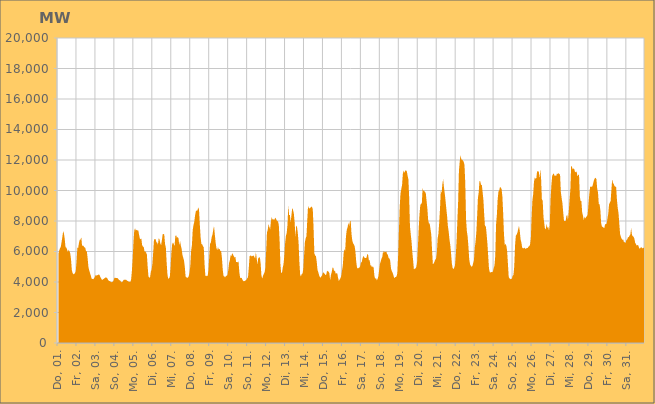
| Category | Series 0 |
|---|---|
|  Do, 01.  | 5838.284 |
|  Do, 01.  | 6069.96 |
|  Do, 01.  | 6217.359 |
|  Do, 01.  | 6301.179 |
|  Do, 01.  | 6617.244 |
|  Do, 01.  | 6944.07 |
|  Do, 01.  | 7326.168 |
|  Do, 01.  | 7187.628 |
|  Do, 01.  | 6828.915 |
|  Do, 01.  | 6288.433 |
|  Do, 01.  | 6265.122 |
|  Do, 01.  | 6128.998 |
|  Do, 01.  | 5971.522 |
|  Do, 01.  | 6115.487 |
|  Do, 01.  | 6014.973 |
|  Do, 01.  | 5880.207 |
|  Do, 01.  | 5474.756 |
|  Fr, 02.  | 4782.747 |
|  Fr, 02.  | 4586.691 |
|  Fr, 02.  | 4509.148 |
|  Fr, 02.  | 4532.63 |
|  Fr, 02.  | 4591.195 |
|  Fr, 02.  | 4716.959 |
|  Fr, 02.  | 5371.067 |
|  Fr, 02.  | 6249.423 |
|  Fr, 02.  | 6234.404 |
|  Fr, 02.  | 6548.627 |
|  Fr, 02.  | 6761.243 |
|  Fr, 02.  | 6771.288 |
|  Fr, 02.  | 6942.361 |
|  Fr, 02.  | 6353.266 |
|  Fr, 02.  | 6406.537 |
|  Fr, 02.  | 6345.504 |
|  Fr, 02.  | 6270.309 |
|  Fr, 02.  | 6242.791 |
|  Fr, 02.  | 6012.417 |
|  Fr, 02.  | 6024.662 |
|  Fr, 02.  | 5564.024 |
|  Fr, 02.  | 4993.995 |
|  Fr, 02.  | 4764.419 |
|  Fr, 02.  | 4591.239 |
|  Sa, 03.  | 4433.387 |
|  Sa, 03.  | 4223.399 |
|  Sa, 03.  | 4198.5 |
|  Sa, 03.  | 4187.236 |
|  Sa, 03.  | 4242.21 |
|  Sa, 03.  | 4322.197 |
|  Sa, 03.  | 4448.25 |
|  Sa, 03.  | 4423.887 |
|  Sa, 03.  | 4439.22 |
|  Sa, 03.  | 4464.962 |
|  Sa, 03.  | 4487.638 |
|  Sa, 03.  | 4472.578 |
|  Sa, 03.  | 4346.734 |
|  Sa, 03.  | 4243.644 |
|  Sa, 03.  | 4150.589 |
|  Sa, 03.  | 4146.145 |
|  Sa, 03.  | 4193.448 |
|  Sa, 03.  | 4234.954 |
|  Sa, 03.  | 4258.034 |
|  Sa, 03.  | 4318.115 |
|  Sa, 03.  | 4276.697 |
|  Sa, 03.  | 4238 |
|  Sa, 03.  | 4132.854 |
|  Sa, 03.  | 4068.32 |
|  So, 04.  | 4059.379 |
|  So, 04.  | 4028.524 |
|  So, 04.  | 3978.109 |
|  So, 04.  | 4019.551 |
|  So, 04.  | 4017.079 |
|  So, 04.  | 4122.61 |
|  So, 04.  | 4276.015 |
|  So, 04.  | 4271.532 |
|  So, 04.  | 4265.931 |
|  So, 04.  | 4260.071 |
|  So, 04.  | 4252.157 |
|  So, 04.  | 4185.498 |
|  So, 04.  | 4120.266 |
|  So, 04.  | 4107.73 |
|  So, 04.  | 4039.33 |
|  So, 04.  | 3981.873 |
|  So, 04.  | 4008.145 |
|  So, 04.  | 4092.39 |
|  So, 04.  | 4150.791 |
|  So, 04.  | 4146.816 |
|  So, 04.  | 4154.551 |
|  So, 04.  | 4141.318 |
|  So, 04.  | 4089.946 |
|  So, 04.  | 4059.761 |
|  Mo, 05.  | 4026.191 |
|  Mo, 05.  | 4009.999 |
|  Mo, 05.  | 4005.91 |
|  Mo, 05.  | 4140.828 |
|  Mo, 05.  | 4688.67 |
|  Mo, 05.  | 5519.541 |
|  Mo, 05.  | 6585.331 |
|  Mo, 05.  | 7371.048 |
|  Mo, 05.  | 7526.508 |
|  Mo, 05.  | 7375.135 |
|  Mo, 05.  | 7422.02 |
|  Mo, 05.  | 7369.848 |
|  Mo, 05.  | 7403.505 |
|  Mo, 05.  | 7136.978 |
|  Mo, 05.  | 6861.888 |
|  Mo, 05.  | 6804.982 |
|  Mo, 05.  | 6856.791 |
|  Mo, 05.  | 6416.836 |
|  Mo, 05.  | 6321.34 |
|  Mo, 05.  | 6299.424 |
|  Mo, 05.  | 5989.073 |
|  Mo, 05.  | 6007.384 |
|  Mo, 05.  | 5941 |
|  Mo, 05.  | 5798.07 |
|  Di, 06.  | 4998.563 |
|  Di, 06.  | 4357.519 |
|  Di, 06.  | 4290.608 |
|  Di, 06.  | 4301.307 |
|  Di, 06.  | 4677.619 |
|  Di, 06.  | 4809.868 |
|  Di, 06.  | 5202.935 |
|  Di, 06.  | 5948.311 |
|  Di, 06.  | 6785.128 |
|  Di, 06.  | 6806.878 |
|  Di, 06.  | 6813.454 |
|  Di, 06.  | 6613.606 |
|  Di, 06.  | 6583.537 |
|  Di, 06.  | 6450.945 |
|  Di, 06.  | 6875.623 |
|  Di, 06.  | 6797.751 |
|  Di, 06.  | 6525.943 |
|  Di, 06.  | 6421.039 |
|  Di, 06.  | 6737.769 |
|  Di, 06.  | 7133.547 |
|  Di, 06.  | 7152.989 |
|  Di, 06.  | 7102.554 |
|  Di, 06.  | 6485.341 |
|  Di, 06.  | 6273.902 |
|  Mi, 07.  | 5291.477 |
|  Mi, 07.  | 4508.332 |
|  Mi, 07.  | 4201.357 |
|  Mi, 07.  | 4248.913 |
|  Mi, 07.  | 4320.959 |
|  Mi, 07.  | 4943.692 |
|  Mi, 07.  | 5891.996 |
|  Mi, 07.  | 6473.568 |
|  Mi, 07.  | 6589.952 |
|  Mi, 07.  | 6508.857 |
|  Mi, 07.  | 6335.647 |
|  Mi, 07.  | 7016.5 |
|  Mi, 07.  | 7073.372 |
|  Mi, 07.  | 6903.334 |
|  Mi, 07.  | 6945.536 |
|  Mi, 07.  | 6871.138 |
|  Mi, 07.  | 6403.369 |
|  Mi, 07.  | 6700.854 |
|  Mi, 07.  | 6378.053 |
|  Mi, 07.  | 6172.952 |
|  Mi, 07.  | 5782.392 |
|  Mi, 07.  | 5598.976 |
|  Mi, 07.  | 5415.007 |
|  Mi, 07.  | 4988.347 |
|  Do, 08.  | 4360.781 |
|  Do, 08.  | 4307.284 |
|  Do, 08.  | 4274.73 |
|  Do, 08.  | 4289.737 |
|  Do, 08.  | 4379.287 |
|  Do, 08.  | 4630.871 |
|  Do, 08.  | 5068.321 |
|  Do, 08.  | 6037.794 |
|  Do, 08.  | 6410.6 |
|  Do, 08.  | 7394.951 |
|  Do, 08.  | 7733.768 |
|  Do, 08.  | 7941.419 |
|  Do, 08.  | 8363.702 |
|  Do, 08.  | 8640.065 |
|  Do, 08.  | 8682.167 |
|  Do, 08.  | 8683.936 |
|  Do, 08.  | 8896.939 |
|  Do, 08.  | 8736.82 |
|  Do, 08.  | 7786.584 |
|  Do, 08.  | 6935.824 |
|  Do, 08.  | 6492.675 |
|  Do, 08.  | 6475.544 |
|  Do, 08.  | 6347.565 |
|  Do, 08.  | 6284.995 |
|  Fr, 09.  | 5175.805 |
|  Fr, 09.  | 4411.382 |
|  Fr, 09.  | 4411.262 |
|  Fr, 09.  | 4383.125 |
|  Fr, 09.  | 4417.873 |
|  Fr, 09.  | 4801.102 |
|  Fr, 09.  | 5715.314 |
|  Fr, 09.  | 6509.222 |
|  Fr, 09.  | 6591.06 |
|  Fr, 09.  | 6939.726 |
|  Fr, 09.  | 7097.465 |
|  Fr, 09.  | 7413.318 |
|  Fr, 09.  | 7665.689 |
|  Fr, 09.  | 7109.803 |
|  Fr, 09.  | 6598.26 |
|  Fr, 09.  | 6233.001 |
|  Fr, 09.  | 6079.949 |
|  Fr, 09.  | 6292.68 |
|  Fr, 09.  | 6132.226 |
|  Fr, 09.  | 6181.967 |
|  Fr, 09.  | 6036.683 |
|  Fr, 09.  | 6030.111 |
|  Fr, 09.  | 5582.783 |
|  Fr, 09.  | 4830.854 |
|  Sa, 10.  | 4394.463 |
|  Sa, 10.  | 4374.086 |
|  Sa, 10.  | 4299.123 |
|  Sa, 10.  | 4392.528 |
|  Sa, 10.  | 4417.415 |
|  Sa, 10.  | 4448.242 |
|  Sa, 10.  | 4764.722 |
|  Sa, 10.  | 5233.12 |
|  Sa, 10.  | 5428.596 |
|  Sa, 10.  | 5756.808 |
|  Sa, 10.  | 5710.557 |
|  Sa, 10.  | 5887.337 |
|  Sa, 10.  | 5806.872 |
|  Sa, 10.  | 5690.213 |
|  Sa, 10.  | 5609.751 |
|  Sa, 10.  | 5641.794 |
|  Sa, 10.  | 5304.069 |
|  Sa, 10.  | 5304.222 |
|  Sa, 10.  | 5291.617 |
|  Sa, 10.  | 5353.647 |
|  Sa, 10.  | 4648.799 |
|  Sa, 10.  | 4295.502 |
|  Sa, 10.  | 4253.544 |
|  Sa, 10.  | 4272.617 |
|  So, 11.  | 4148.407 |
|  So, 11.  | 4062.998 |
|  So, 11.  | 4050.399 |
|  So, 11.  | 4071.035 |
|  So, 11.  | 4112.451 |
|  So, 11.  | 4144.704 |
|  So, 11.  | 4245.584 |
|  So, 11.  | 4309.784 |
|  So, 11.  | 4925.778 |
|  So, 11.  | 5690.34 |
|  So, 11.  | 5747.041 |
|  So, 11.  | 5674.559 |
|  So, 11.  | 5730.163 |
|  So, 11.  | 5689.383 |
|  So, 11.  | 5758.914 |
|  So, 11.  | 5640.602 |
|  So, 11.  | 5553.907 |
|  So, 11.  | 5953.618 |
|  So, 11.  | 5561.133 |
|  So, 11.  | 5132.685 |
|  So, 11.  | 5585.76 |
|  So, 11.  | 5579.77 |
|  So, 11.  | 5641.804 |
|  So, 11.  | 5201.269 |
|  Mo, 12.  | 4414.718 |
|  Mo, 12.  | 4231.42 |
|  Mo, 12.  | 4402.162 |
|  Mo, 12.  | 4535.949 |
|  Mo, 12.  | 4640.257 |
|  Mo, 12.  | 4935.785 |
|  Mo, 12.  | 6022.928 |
|  Mo, 12.  | 7248.038 |
|  Mo, 12.  | 7423.967 |
|  Mo, 12.  | 7805.238 |
|  Mo, 12.  | 7614.017 |
|  Mo, 12.  | 7463.201 |
|  Mo, 12.  | 7974.287 |
|  Mo, 12.  | 8260.465 |
|  Mo, 12.  | 8092.553 |
|  Mo, 12.  | 8130.125 |
|  Mo, 12.  | 8058.65 |
|  Mo, 12.  | 8160.743 |
|  Mo, 12.  | 8210.63 |
|  Mo, 12.  | 8064.475 |
|  Mo, 12.  | 8007.339 |
|  Mo, 12.  | 7974.572 |
|  Mo, 12.  | 7735.249 |
|  Mo, 12.  | 6700.836 |
|  Di, 13.  | 5146.422 |
|  Di, 13.  | 4593.487 |
|  Di, 13.  | 4603.94 |
|  Di, 13.  | 4939.973 |
|  Di, 13.  | 5192.146 |
|  Di, 13.  | 5738.624 |
|  Di, 13.  | 6554.945 |
|  Di, 13.  | 7023.418 |
|  Di, 13.  | 7220.844 |
|  Di, 13.  | 7765.521 |
|  Di, 13.  | 9040.237 |
|  Di, 13.  | 8395.793 |
|  Di, 13.  | 8391.384 |
|  Di, 13.  | 7911.724 |
|  Di, 13.  | 8388.636 |
|  Di, 13.  | 8865.622 |
|  Di, 13.  | 8720.192 |
|  Di, 13.  | 8493.211 |
|  Di, 13.  | 7940.669 |
|  Di, 13.  | 6963.544 |
|  Di, 13.  | 7700.133 |
|  Di, 13.  | 7632.044 |
|  Di, 13.  | 7230.369 |
|  Di, 13.  | 6589.781 |
|  Mi, 14.  | 5339.033 |
|  Mi, 14.  | 4482.851 |
|  Mi, 14.  | 4366.61 |
|  Mi, 14.  | 4520.774 |
|  Mi, 14.  | 4552.585 |
|  Mi, 14.  | 4835.391 |
|  Mi, 14.  | 5761.337 |
|  Mi, 14.  | 6608.807 |
|  Mi, 14.  | 6869.341 |
|  Mi, 14.  | 6999.013 |
|  Mi, 14.  | 8035.343 |
|  Mi, 14.  | 8982.962 |
|  Mi, 14.  | 8857.194 |
|  Mi, 14.  | 8821.02 |
|  Mi, 14.  | 8870.807 |
|  Mi, 14.  | 8942.107 |
|  Mi, 14.  | 8928.426 |
|  Mi, 14.  | 8766.124 |
|  Mi, 14.  | 7522.567 |
|  Mi, 14.  | 5876.222 |
|  Mi, 14.  | 5735.126 |
|  Mi, 14.  | 5701.514 |
|  Mi, 14.  | 5318.03 |
|  Mi, 14.  | 4790.274 |
|  Do, 15.  | 4641.297 |
|  Do, 15.  | 4442.467 |
|  Do, 15.  | 4320.562 |
|  Do, 15.  | 4289.356 |
|  Do, 15.  | 4385.777 |
|  Do, 15.  | 4463.116 |
|  Do, 15.  | 4635.253 |
|  Do, 15.  | 4594.274 |
|  Do, 15.  | 4538.257 |
|  Do, 15.  | 4466.3 |
|  Do, 15.  | 4467.368 |
|  Do, 15.  | 4740.441 |
|  Do, 15.  | 4704.173 |
|  Do, 15.  | 4681.504 |
|  Do, 15.  | 4575.955 |
|  Do, 15.  | 4117.87 |
|  Do, 15.  | 4474.166 |
|  Do, 15.  | 4649.174 |
|  Do, 15.  | 4949.576 |
|  Do, 15.  | 4926.898 |
|  Do, 15.  | 4705.59 |
|  Do, 15.  | 4761.182 |
|  Do, 15.  | 4541.561 |
|  Do, 15.  | 4574.133 |
|  Fr, 16.  | 4568.982 |
|  Fr, 16.  | 4276.202 |
|  Fr, 16.  | 4055.814 |
|  Fr, 16.  | 4162.918 |
|  Fr, 16.  | 4246.035 |
|  Fr, 16.  | 4399.295 |
|  Fr, 16.  | 4754.47 |
|  Fr, 16.  | 5087.843 |
|  Fr, 16.  | 5859.401 |
|  Fr, 16.  | 6148.99 |
|  Fr, 16.  | 6060.739 |
|  Fr, 16.  | 6984.952 |
|  Fr, 16.  | 7417.109 |
|  Fr, 16.  | 7578.792 |
|  Fr, 16.  | 7896.166 |
|  Fr, 16.  | 7668.844 |
|  Fr, 16.  | 7970.368 |
|  Fr, 16.  | 8018.609 |
|  Fr, 16.  | 7143.986 |
|  Fr, 16.  | 6720.794 |
|  Fr, 16.  | 6545.304 |
|  Fr, 16.  | 6464.661 |
|  Fr, 16.  | 6335.683 |
|  Fr, 16.  | 5976.97 |
|  Sa, 17.  | 5321.862 |
|  Sa, 17.  | 4949.645 |
|  Sa, 17.  | 4882.43 |
|  Sa, 17.  | 4920.575 |
|  Sa, 17.  | 4944.293 |
|  Sa, 17.  | 5034.639 |
|  Sa, 17.  | 5279.085 |
|  Sa, 17.  | 5317.498 |
|  Sa, 17.  | 5567.992 |
|  Sa, 17.  | 5710.331 |
|  Sa, 17.  | 5632.373 |
|  Sa, 17.  | 5571.872 |
|  Sa, 17.  | 5572.065 |
|  Sa, 17.  | 5593.363 |
|  Sa, 17.  | 5833.895 |
|  Sa, 17.  | 5787.231 |
|  Sa, 17.  | 5427.939 |
|  Sa, 17.  | 5423.641 |
|  Sa, 17.  | 5079.078 |
|  Sa, 17.  | 5080.742 |
|  Sa, 17.  | 4950.885 |
|  Sa, 17.  | 5031.101 |
|  Sa, 17.  | 4939.251 |
|  Sa, 17.  | 4406.891 |
|  So, 18.  | 4198.301 |
|  So, 18.  | 4282.472 |
|  So, 18.  | 4107.482 |
|  So, 18.  | 4195.86 |
|  So, 18.  | 4372.243 |
|  So, 18.  | 4780.243 |
|  So, 18.  | 5188.425 |
|  So, 18.  | 5350.864 |
|  So, 18.  | 5542.183 |
|  So, 18.  | 5638.607 |
|  So, 18.  | 6037.969 |
|  So, 18.  | 5905.502 |
|  So, 18.  | 6015 |
|  So, 18.  | 5956.332 |
|  So, 18.  | 6018.275 |
|  So, 18.  | 5827.577 |
|  So, 18.  | 5791.668 |
|  So, 18.  | 5573.189 |
|  So, 18.  | 5543.267 |
|  So, 18.  | 5385.71 |
|  So, 18.  | 4884.689 |
|  So, 18.  | 4723.663 |
|  So, 18.  | 4609.493 |
|  So, 18.  | 4462.552 |
|  Mo, 19.  | 4247.807 |
|  Mo, 19.  | 4311.431 |
|  Mo, 19.  | 4329.222 |
|  Mo, 19.  | 4361.841 |
|  Mo, 19.  | 4582.218 |
|  Mo, 19.  | 5691.175 |
|  Mo, 19.  | 7306.368 |
|  Mo, 19.  | 8878.472 |
|  Mo, 19.  | 9796.363 |
|  Mo, 19.  | 10093.189 |
|  Mo, 19.  | 10358.222 |
|  Mo, 19.  | 11092.372 |
|  Mo, 19.  | 11301.88 |
|  Mo, 19.  | 11152.729 |
|  Mo, 19.  | 11318.867 |
|  Mo, 19.  | 11318.199 |
|  Mo, 19.  | 11261.021 |
|  Mo, 19.  | 10977.977 |
|  Mo, 19.  | 10730.177 |
|  Mo, 19.  | 9558.51 |
|  Mo, 19.  | 7648.774 |
|  Mo, 19.  | 7128.25 |
|  Mo, 19.  | 6651.674 |
|  Mo, 19.  | 5950.547 |
|  Di, 20.  | 5409.848 |
|  Di, 20.  | 4822.269 |
|  Di, 20.  | 4881.608 |
|  Di, 20.  | 4888.259 |
|  Di, 20.  | 4976.979 |
|  Di, 20.  | 5282.412 |
|  Di, 20.  | 6245.57 |
|  Di, 20.  | 7428.679 |
|  Di, 20.  | 8370.268 |
|  Di, 20.  | 9004.075 |
|  Di, 20.  | 9146.274 |
|  Di, 20.  | 9135.82 |
|  Di, 20.  | 10145.512 |
|  Di, 20.  | 9983.426 |
|  Di, 20.  | 9990.168 |
|  Di, 20.  | 9888.28 |
|  Di, 20.  | 9840.652 |
|  Di, 20.  | 9336.417 |
|  Di, 20.  | 8837.784 |
|  Di, 20.  | 8095.137 |
|  Di, 20.  | 7835.428 |
|  Di, 20.  | 7831.601 |
|  Di, 20.  | 7471.004 |
|  Di, 20.  | 7098.428 |
|  Mi, 21.  | 6068.458 |
|  Mi, 21.  | 5174.112 |
|  Mi, 21.  | 5209.523 |
|  Mi, 21.  | 5326.591 |
|  Mi, 21.  | 5467.836 |
|  Mi, 21.  | 5521.643 |
|  Mi, 21.  | 5889.987 |
|  Mi, 21.  | 6840.601 |
|  Mi, 21.  | 7160.358 |
|  Mi, 21.  | 7885.918 |
|  Mi, 21.  | 8770.664 |
|  Mi, 21.  | 9995.004 |
|  Mi, 21.  | 9832.952 |
|  Mi, 21.  | 10393.415 |
|  Mi, 21.  | 10748.857 |
|  Mi, 21.  | 10219.216 |
|  Mi, 21.  | 9827.922 |
|  Mi, 21.  | 9351.696 |
|  Mi, 21.  | 8815.705 |
|  Mi, 21.  | 8314.682 |
|  Mi, 21.  | 7662.106 |
|  Mi, 21.  | 7313.584 |
|  Mi, 21.  | 6785.041 |
|  Mi, 21.  | 6445.28 |
|  Do, 22.  | 5891.578 |
|  Do, 22.  | 5230.182 |
|  Do, 22.  | 4922.247 |
|  Do, 22.  | 4843.508 |
|  Do, 22.  | 4935.611 |
|  Do, 22.  | 5096.726 |
|  Do, 22.  | 5724.205 |
|  Do, 22.  | 6720.53 |
|  Do, 22.  | 8028.536 |
|  Do, 22.  | 9281.414 |
|  Do, 22.  | 11306.111 |
|  Do, 22.  | 11898.174 |
|  Do, 22.  | 12324.246 |
|  Do, 22.  | 12040.704 |
|  Do, 22.  | 12026.36 |
|  Do, 22.  | 11963.468 |
|  Do, 22.  | 11885.799 |
|  Do, 22.  | 11681.94 |
|  Do, 22.  | 10488.123 |
|  Do, 22.  | 8115.934 |
|  Do, 22.  | 7338.527 |
|  Do, 22.  | 6980.905 |
|  Do, 22.  | 6325.489 |
|  Do, 22.  | 5495.74 |
|  Fr, 23.  | 5172.039 |
|  Fr, 23.  | 5064.422 |
|  Fr, 23.  | 4996.076 |
|  Fr, 23.  | 5047.531 |
|  Fr, 23.  | 5230.776 |
|  Fr, 23.  | 5426.757 |
|  Fr, 23.  | 6215.066 |
|  Fr, 23.  | 6653.791 |
|  Fr, 23.  | 7240.187 |
|  Fr, 23.  | 8289.333 |
|  Fr, 23.  | 9494.488 |
|  Fr, 23.  | 9872.862 |
|  Fr, 23.  | 10630.551 |
|  Fr, 23.  | 10600.301 |
|  Fr, 23.  | 10346.088 |
|  Fr, 23.  | 10378.367 |
|  Fr, 23.  | 9874.329 |
|  Fr, 23.  | 9362.285 |
|  Fr, 23.  | 8391.536 |
|  Fr, 23.  | 7605.526 |
|  Fr, 23.  | 7703.098 |
|  Fr, 23.  | 7163.701 |
|  Fr, 23.  | 6534.049 |
|  Fr, 23.  | 5721.008 |
|  Sa, 24.  | 4888.398 |
|  Sa, 24.  | 4644.566 |
|  Sa, 24.  | 4620.128 |
|  Sa, 24.  | 4658.844 |
|  Sa, 24.  | 4638.544 |
|  Sa, 24.  | 4697.674 |
|  Sa, 24.  | 4913.412 |
|  Sa, 24.  | 5083.407 |
|  Sa, 24.  | 5738.254 |
|  Sa, 24.  | 7784.402 |
|  Sa, 24.  | 8398.634 |
|  Sa, 24.  | 9414.674 |
|  Sa, 24.  | 9928.049 |
|  Sa, 24.  | 10015.294 |
|  Sa, 24.  | 10244.008 |
|  Sa, 24.  | 10183.543 |
|  Sa, 24.  | 10089.884 |
|  Sa, 24.  | 9592.666 |
|  Sa, 24.  | 8488.618 |
|  Sa, 24.  | 7126.29 |
|  Sa, 24.  | 6406.991 |
|  Sa, 24.  | 6503.843 |
|  Sa, 24.  | 6378.775 |
|  Sa, 24.  | 6032.467 |
|  So, 25.  | 5195.957 |
|  So, 25.  | 4328.444 |
|  So, 25.  | 4244.727 |
|  So, 25.  | 4180.253 |
|  So, 25.  | 4217.454 |
|  So, 25.  | 4219.837 |
|  So, 25.  | 4404.177 |
|  So, 25.  | 4471.624 |
|  So, 25.  | 5014.535 |
|  So, 25.  | 6387.058 |
|  So, 25.  | 7031.906 |
|  So, 25.  | 7113.354 |
|  So, 25.  | 7239.591 |
|  So, 25.  | 7460.926 |
|  So, 25.  | 7680.393 |
|  So, 25.  | 7338.941 |
|  So, 25.  | 6802.477 |
|  So, 25.  | 6605.735 |
|  So, 25.  | 6264.503 |
|  So, 25.  | 6210.049 |
|  So, 25.  | 6208.661 |
|  So, 25.  | 6261.902 |
|  So, 25.  | 6168.204 |
|  So, 25.  | 6209.28 |
|  Mo, 26.  | 6221.116 |
|  Mo, 26.  | 6229.44 |
|  Mo, 26.  | 6322.894 |
|  Mo, 26.  | 6340.736 |
|  Mo, 26.  | 6446.494 |
|  Mo, 26.  | 6854.41 |
|  Mo, 26.  | 8270.967 |
|  Mo, 26.  | 9375.041 |
|  Mo, 26.  | 9759.042 |
|  Mo, 26.  | 10573.69 |
|  Mo, 26.  | 10862.774 |
|  Mo, 26.  | 10765.564 |
|  Mo, 26.  | 10817.232 |
|  Mo, 26.  | 11298.953 |
|  Mo, 26.  | 11210.657 |
|  Mo, 26.  | 11284.779 |
|  Mo, 26.  | 10790.209 |
|  Mo, 26.  | 11400.662 |
|  Mo, 26.  | 10752.534 |
|  Mo, 26.  | 9408.415 |
|  Mo, 26.  | 9342.432 |
|  Mo, 26.  | 8267.455 |
|  Mo, 26.  | 7842.733 |
|  Mo, 26.  | 7446.702 |
|  Di, 27.  | 7512.668 |
|  Di, 27.  | 7799.565 |
|  Di, 27.  | 7542.499 |
|  Di, 27.  | 7621.497 |
|  Di, 27.  | 7364.262 |
|  Di, 27.  | 7747.679 |
|  Di, 27.  | 9471.058 |
|  Di, 27.  | 10343.993 |
|  Di, 27.  | 10949.849 |
|  Di, 27.  | 11062.4 |
|  Di, 27.  | 11132.685 |
|  Di, 27.  | 10961.562 |
|  Di, 27.  | 10981.221 |
|  Di, 27.  | 10953.306 |
|  Di, 27.  | 11109.434 |
|  Di, 27.  | 11083.859 |
|  Di, 27.  | 11143.417 |
|  Di, 27.  | 11084.306 |
|  Di, 27.  | 11029.986 |
|  Di, 27.  | 9898.13 |
|  Di, 27.  | 9491.859 |
|  Di, 27.  | 9162.701 |
|  Di, 27.  | 8546.719 |
|  Di, 27.  | 8006.356 |
|  Mi, 28.  | 7994.516 |
|  Mi, 28.  | 7991.439 |
|  Mi, 28.  | 8319.045 |
|  Mi, 28.  | 8421.586 |
|  Mi, 28.  | 8082.05 |
|  Mi, 28.  | 8605.735 |
|  Mi, 28.  | 9386.125 |
|  Mi, 28.  | 10041.509 |
|  Mi, 28.  | 11610.239 |
|  Mi, 28.  | 11556.366 |
|  Mi, 28.  | 11387.587 |
|  Mi, 28.  | 11447.682 |
|  Mi, 28.  | 11394.645 |
|  Mi, 28.  | 11196.61 |
|  Mi, 28.  | 11230.572 |
|  Mi, 28.  | 11231.314 |
|  Mi, 28.  | 10920.389 |
|  Mi, 28.  | 11034.294 |
|  Mi, 28.  | 11039.352 |
|  Mi, 28.  | 9611.575 |
|  Mi, 28.  | 9306.963 |
|  Mi, 28.  | 9302.013 |
|  Mi, 28.  | 8545.169 |
|  Mi, 28.  | 8354.807 |
|  Do, 29.  | 8050.733 |
|  Do, 29.  | 8291.584 |
|  Do, 29.  | 8152.58 |
|  Do, 29.  | 8285.599 |
|  Do, 29.  | 8302.823 |
|  Do, 29.  | 8444.855 |
|  Do, 29.  | 9142.819 |
|  Do, 29.  | 9764.807 |
|  Do, 29.  | 10222.033 |
|  Do, 29.  | 10269.11 |
|  Do, 29.  | 10243.466 |
|  Do, 29.  | 10280.502 |
|  Do, 29.  | 10493.447 |
|  Do, 29.  | 10699.709 |
|  Do, 29.  | 10799.662 |
|  Do, 29.  | 10831.309 |
|  Do, 29.  | 10742.506 |
|  Do, 29.  | 10114.151 |
|  Do, 29.  | 9887.407 |
|  Do, 29.  | 9107.677 |
|  Do, 29.  | 9101.828 |
|  Do, 29.  | 8711.34 |
|  Do, 29.  | 7851.493 |
|  Do, 29.  | 7631.13 |
|  Fr, 30.  | 7617.558 |
|  Fr, 30.  | 7559.451 |
|  Fr, 30.  | 7539.813 |
|  Fr, 30.  | 7787.547 |
|  Fr, 30.  | 7797.389 |
|  Fr, 30.  | 7834.728 |
|  Fr, 30.  | 8164.314 |
|  Fr, 30.  | 8488.806 |
|  Fr, 30.  | 9080.333 |
|  Fr, 30.  | 9213.24 |
|  Fr, 30.  | 9318.549 |
|  Fr, 30.  | 10060.2 |
|  Fr, 30.  | 10748.55 |
|  Fr, 30.  | 10477.031 |
|  Fr, 30.  | 10427.932 |
|  Fr, 30.  | 10277.689 |
|  Fr, 30.  | 10262.06 |
|  Fr, 30.  | 10212.338 |
|  Fr, 30.  | 9388.705 |
|  Fr, 30.  | 8840.862 |
|  Fr, 30.  | 8517.167 |
|  Fr, 30.  | 7797.779 |
|  Fr, 30.  | 7135.128 |
|  Fr, 30.  | 6954.848 |
|  Sa, 31.  | 6831.311 |
|  Sa, 31.  | 6768.448 |
|  Sa, 31.  | 6781.068 |
|  Sa, 31.  | 6579.798 |
|  Sa, 31.  | 6642.067 |
|  Sa, 31.  | 6551.066 |
|  Sa, 31.  | 6761.363 |
|  Sa, 31.  | 6787.011 |
|  Sa, 31.  | 6936.431 |
|  Sa, 31.  | 6944.697 |
|  Sa, 31.  | 7044.531 |
|  Sa, 31.  | 7133.604 |
|  Sa, 31.  | 7539.556 |
|  Sa, 31.  | 7090.902 |
|  Sa, 31.  | 7007.825 |
|  Sa, 31.  | 6969.78 |
|  Sa, 31.  | 6856.041 |
|  Sa, 31.  | 6579.474 |
|  Sa, 31.  | 6485.681 |
|  Sa, 31.  | 6388.016 |
|  Sa, 31.  | 6438.408 |
|  Sa, 31.  | 6392.61 |
|  Sa, 31.  | 6230.603 |
|  Sa, 31.  | 6178.391 |
|  So, 01.  | 6258.037 |
|  So, 01.  | 6280.834 |
|  So, 01.  | 6217.139 |
|  So, 01.  | 6216.846 |
|  So, 01.  | 6250.928 |
|  So, 01.  | 6304.597 |